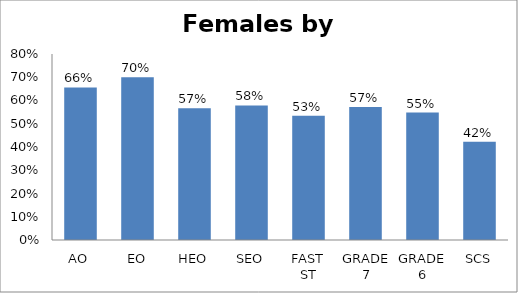
| Category | Female |
|---|---|
| AO | 0.656 |
| EO | 0.7 |
| HEO | 0.567 |
| SEO | 0.579 |
| FAST ST | 0.534 |
| GRADE 7 | 0.572 |
| GRADE 6 | 0.548 |
| SCS | 0.423 |